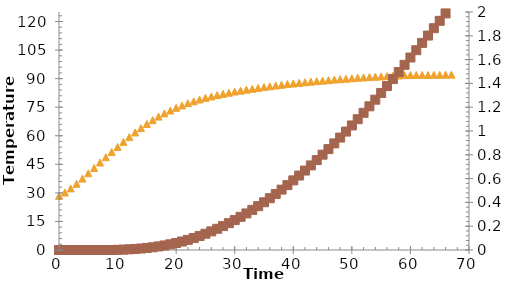
| Category | Series 0 |
|---|---|
| 0.0 | 28.45 |
| 1.0 | 30.2 |
| 2.0 | 32.35 |
| 3.0 | 34.8 |
| 4.0 | 37.5 |
| 5.0 | 40.3 |
| 6.0 | 43.1 |
| 7.0 | 45.95 |
| 8.0 | 48.75 |
| 9.0 | 51.5 |
| 10.0 | 54.1 |
| 11.0 | 56.8 |
| 12.0 | 59.3 |
| 13.0 | 61.75 |
| 14.0 | 64 |
| 15.0 | 66.2 |
| 16.0 | 68.2 |
| 17.0 | 70.05 |
| 18.0 | 71.75 |
| 19.0 | 73.25 |
| 20.0 | 74.7 |
| 21.0 | 75.9 |
| 22.0 | 77.1 |
| 23.0 | 78.1 |
| 24.0 | 79.05 |
| 25.0 | 79.9 |
| 26.0 | 80.65 |
| 27.0 | 81.35 |
| 28.0 | 82 |
| 29.0 | 82.6 |
| 30.0 | 83.2 |
| 31.0 | 83.7 |
| 32.0 | 84.2 |
| 33.0 | 84.65 |
| 34.0 | 85.1 |
| 35.0 | 85.6 |
| 36.0 | 85.95 |
| 37.0 | 86.4 |
| 38.0 | 86.75 |
| 39.0 | 87.15 |
| 40.0 | 87.45 |
| 41.0 | 87.8 |
| 42.0 | 88.1 |
| 43.0 | 88.4 |
| 44.0 | 88.7 |
| 45.0 | 88.95 |
| 46.0 | 89.2 |
| 47.0 | 89.5 |
| 48.0 | 89.7 |
| 49.0 | 89.95 |
| 50.0 | 90.15 |
| 51.0 | 90.45 |
| 52.0 | 90.6 |
| 53.0 | 90.8 |
| 54.0 | 91 |
| 55.0 | 91.15 |
| 56.0 | 91.35 |
| 57.0 | 91.55 |
| 58.0 | 91.65 |
| 59.0 | 91.85 |
| 60.0 | 91.95 |
| 61.0 | 91.95 |
| 62.0 | 91.95 |
| 63.0 | 91.9 |
| 64.0 | 92.05 |
| 65.0 | 92 |
| 66.0 | 92.1 |
| 67.0 | 92.1 |